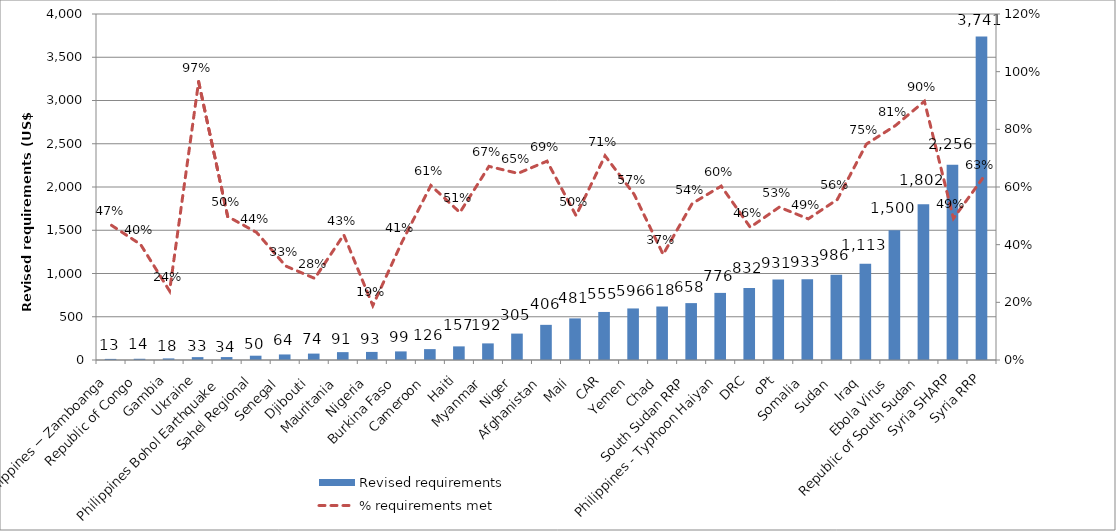
| Category | Revised requirements  |
|---|---|
| Philippines − Zamboanga  | 12.796 |
| Republic of Congo  | 14.269 |
| Gambia  | 18.319 |
| Ukraine | 33.202 |
| Philippines Bohol Earthquake  | 33.829 |
| Sahel Regional  | 49.76 |
| Senegal  | 64.133 |
| Djibouti  | 74.085 |
| Mauritania  | 90.923 |
| Nigeria  | 93.397 |
| Burkina Faso  | 99.334 |
| Cameroon  | 125.77 |
| Haiti  | 157.455 |
| Myanmar  | 192.023 |
| Niger  | 305.236 |
| Afghanistan  | 406.43 |
| Mali  | 481.021 |
| CAR | 555.426 |
| Yemen  | 595.983 |
| Chad  | 618.458 |
| South Sudan RRP | 657.67 |
| Philippines - Typhoon Haiyan  | 775.749 |
| DRC | 832.097 |
| oPt | 931.086 |
| Somalia  | 933.07 |
| Sudan  | 985.697 |
| Iraq  | 1113.277 |
| Ebola Virus  | 1500 |
| Republic of South Sudan  | 1801.753 |
| Syria SHARP | 2256.199 |
| Syria RRP | 3740.655 |